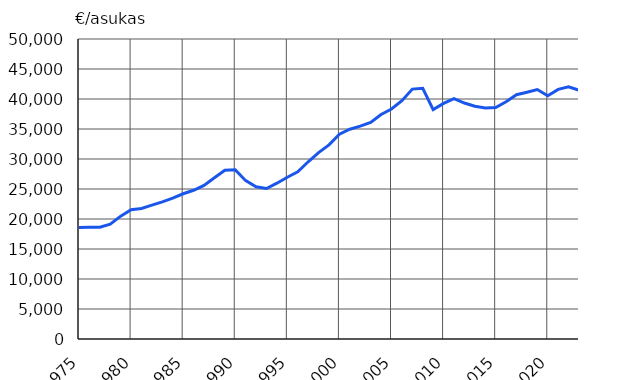
| Category |  €/asukas |
|---|---|
| 1975 | 18576 |
| 1976 | 18613 |
| 1977 | 18621 |
| 1978 | 19152 |
| 1979 | 20475 |
| 1980 | 21561 |
| 1981 | 21751 |
| 1982 | 22302 |
| 1983 | 22860 |
| 1984 | 23475 |
| 1985 | 24207 |
| 1986 | 24793 |
| 1987 | 25607 |
| 1988 | 26864 |
| 1989 | 28129 |
| 1990 | 28193 |
| 1991 | 26389 |
| 1992 | 25376 |
| 1993 | 25087 |
| 1994 | 25969 |
| 1995 | 26961 |
| 1996 | 27858 |
| 1997 | 29535 |
| 1998 | 31064 |
| 1999 | 32349 |
| 2000 | 34145 |
| 2001 | 34957 |
| 2002 | 35468 |
| 2003 | 36092 |
| 2004 | 37424 |
| 2005 | 38333 |
| 2006 | 39724 |
| 2007 | 41652 |
| 2008 | 41783 |
| 2009 | 38226 |
| 2010 | 39263 |
| 2011 | 40078 |
| 2012 | 39330 |
| 2013 | 38796 |
| 2014 | 38488 |
| 2015 | 38570 |
| 2016 | 39548 |
| 2017 | 40715 |
| 2018 | 41119 |
| 2019 | 41582 |
| 2020 | 40536 |
| 2021 | 41605 |
| 2022* | 42044 |
| 2023* | 41456 |